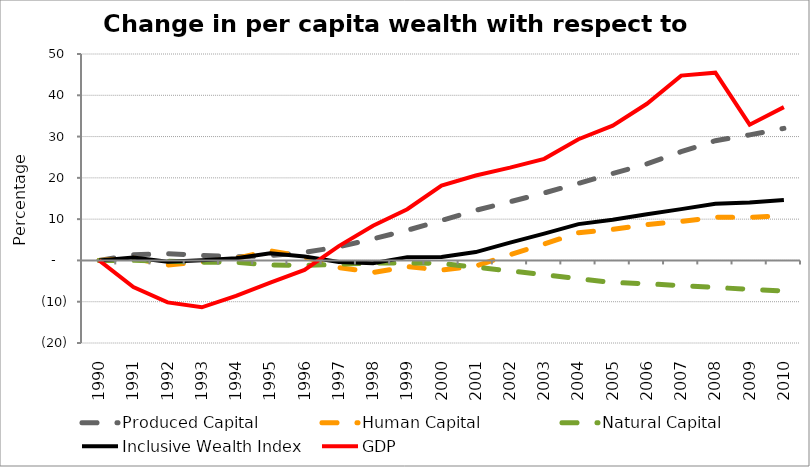
| Category | Produced Capital  | Human Capital | Natural Capital | Inclusive Wealth Index | GDP |
|---|---|---|---|---|---|
| 1990.0 | 0 | 0 | 0 | 0 | 0 |
| 1991.0 | 1.354 | 0.565 | 0.024 | 0.719 | -6.439 |
| 1992.0 | 1.654 | -1.107 | -0.194 | -0.334 | -10.162 |
| 1993.0 | 1.238 | -0.362 | -0.441 | 0.035 | -11.351 |
| 1994.0 | 0.852 | 0.531 | -0.46 | 0.529 | -8.597 |
| 1995.0 | 1.155 | 2.339 | -1.107 | 1.753 | -5.373 |
| 1996.0 | 1.944 | 0.817 | -1.168 | 0.936 | -2.313 |
| 1997.0 | 3.289 | -1.708 | -0.939 | -0.381 | 3.463 |
| 1998.0 | 5.237 | -2.917 | -0.647 | -0.668 | 8.407 |
| 1999.0 | 7.31 | -1.502 | -0.586 | 0.8 | 12.398 |
| 2000.0 | 9.69 | -2.354 | -0.738 | 0.823 | 18.143 |
| 2001.0 | 12.143 | -1.361 | -1.653 | 2.026 | 20.568 |
| 2002.0 | 14.206 | 1.397 | -2.531 | 4.306 | 22.477 |
| 2003.0 | 16.343 | 3.987 | -3.442 | 6.489 | 24.609 |
| 2004.0 | 18.66 | 6.702 | -4.399 | 8.798 | 29.35 |
| 2005.0 | 21.056 | 7.52 | -5.349 | 9.867 | 32.66 |
| 2006.0 | 23.387 | 8.677 | -5.637 | 11.201 | 37.942 |
| 2007.0 | 26.327 | 9.455 | -6.096 | 12.421 | 44.77 |
| 2008.0 | 28.999 | 10.441 | -6.55 | 13.713 | 45.481 |
| 2009.0 | 30.417 | 10.448 | -6.991 | 14.039 | 32.883 |
| 2010.0 | 31.991 | 10.841 | -7.408 | 14.663 | 37.134 |